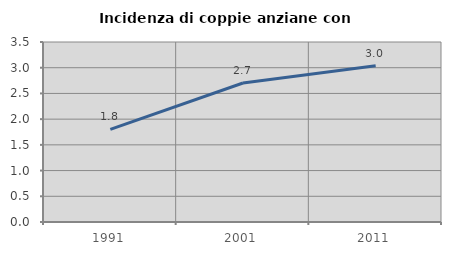
| Category | Incidenza di coppie anziane con figli |
|---|---|
| 1991.0 | 1.802 |
| 2001.0 | 2.703 |
| 2011.0 | 3.038 |